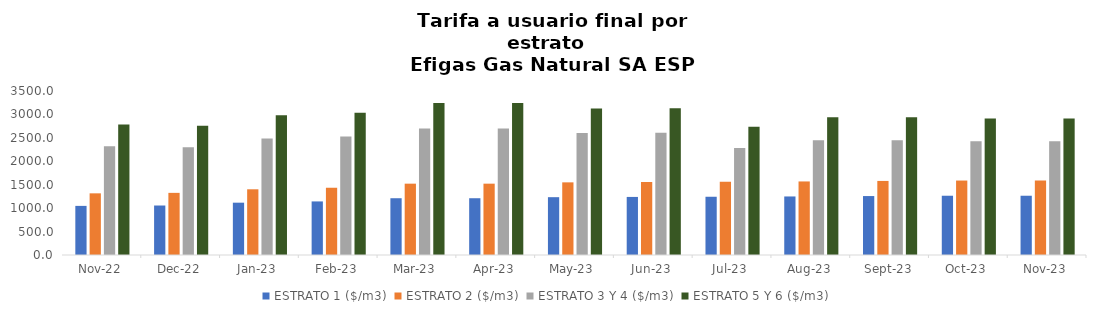
| Category | ESTRATO 1 ($/m3) | ESTRATO 2 ($/m3) | ESTRATO 3 Y 4 ($/m3) | ESTRATO 5 Y 6 ($/m3) |
|---|---|---|---|---|
| 2022-11-01 | 1048.08 | 1315.96 | 2318.8 | 2782.56 |
| 2022-12-01 | 1056.14 | 1326.08 | 2297.18 | 2756.616 |
| 2023-01-01 | 1116.6 | 1402.33 | 2485 | 2982 |
| 2023-02-01 | 1143.48 | 1435.53 | 2531 | 3037.2 |
| 2023-03-01 | 1211.66 | 1522.37 | 2701.57 | 3241.884 |
| 2023-04-01 | 1211.66 | 1522.37 | 2701.57 | 3241.884 |
| 2023-05-01 | 1233.96 | 1550.39 | 2603.83 | 3124.596 |
| 2023-06-01 | 1239.35 | 1557.16 | 2610.15 | 3132.18 |
| 2023-07-01 | 1243.07 | 1561.83 | 2281.753 | 2738.104 |
| 2023-08-01 | 1249.3 | 1569.65 | 2451.116 | 2941.34 |
| 2023-09-01 | 1258.03 | 1580.63 | 2447.703 | 2937.244 |
| 2023-10-01 | 1264.72 | 1589.03 | 2427.174 | 2912.609 |
| 2023-11-01 | 1264.72 | 1589.03 | 2427.174 | 2912.609 |